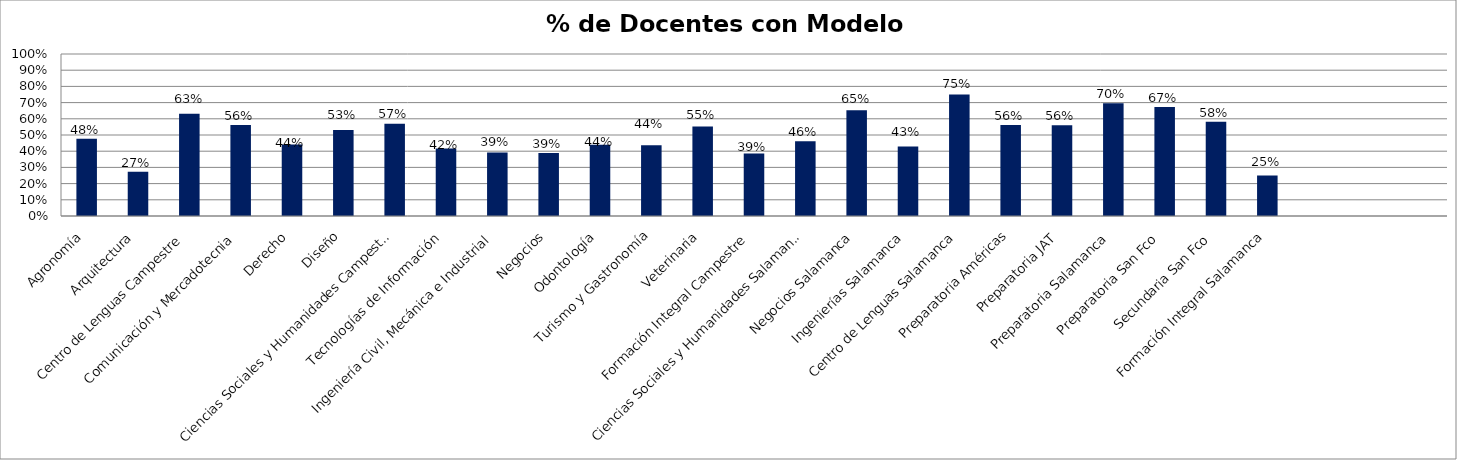
| Category | Series 1 |
|---|---|
| Agronomía | 0.476 |
| Arquitectura | 0.274 |
| Centro de Lenguas Campestre | 0.631 |
| Comunicación y Mercadotecnia | 0.562 |
| Derecho | 0.441 |
| Diseño | 0.53 |
| Ciencias Sociales y Humanidades Campestre | 0.57 |
| Tecnologías de Información | 0.417 |
| Ingeniería Civil, Mecánica e Industrial | 0.391 |
| Negocios | 0.389 |
| Odontología | 0.44 |
| Turismo y Gastronomía | 0.438 |
| Veterinaria | 0.553 |
| Formación Integral Campestre | 0.386 |
| Ciencias Sociales y Humanidades Salamanca | 0.462 |
| Negocios Salamanca | 0.653 |
| Ingenierías Salamanca | 0.429 |
| Centro de Lenguas Salamanca | 0.75 |
| Preparatoria Américas | 0.562 |
| Preparatoria JAT | 0.56 |
| Preparatoria Salamanca | 0.696 |
| Preparatoria San Fco | 0.673 |
| Secundaria San Fco | 0.581 |
| Formación Integral Salamanca | 0.25 |